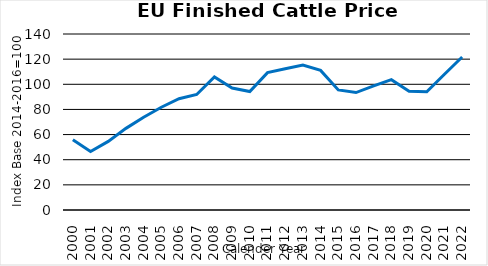
| Category | AT, CH, CZ, DE, ES, 
FI, FR, IE, IT, PT, PL |
|---|---|
| 2000.0 | 55.901 |
| 2001.0 | 46.582 |
| 2002.0 | 54.57 |
| 2003.0 | 64.943 |
| 2004.0 | 73.829 |
| 2005.0 | 81.757 |
| 2006.0 | 88.49 |
| 2007.0 | 91.869 |
| 2008.0 | 105.887 |
| 2009.0 | 97.059 |
| 2010.0 | 94.241 |
| 2011.0 | 109.255 |
| 2012.0 | 112.286 |
| 2013.0 | 115.288 |
| 2014.0 | 111.061 |
| 2015.0 | 95.506 |
| 2016.0 | 93.432 |
| 2017.0 | 98.725 |
| 2018.0 | 103.706 |
| 2019.0 | 94.379 |
| 2020.0 | 94.022 |
| 2021.0 | 108.003 |
| 2022.0 | 121.675 |